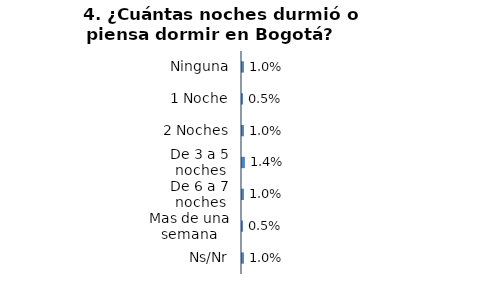
| Category | Series 0 |
|---|---|
| Ninguna | 0.01 |
| 1 Noche | 0.005 |
| 2 Noches | 0.01 |
| De 3 a 5 noches | 0.014 |
| De 6 a 7 noches | 0.01 |
| Mas de una semana | 0.005 |
| Ns/Nr | 0.01 |